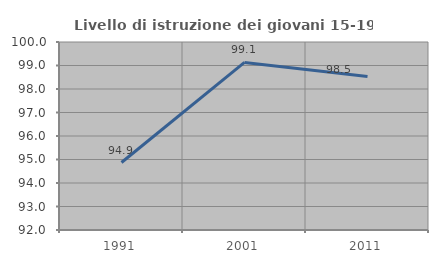
| Category | Livello di istruzione dei giovani 15-19 anni |
|---|---|
| 1991.0 | 94.872 |
| 2001.0 | 99.13 |
| 2011.0 | 98.533 |